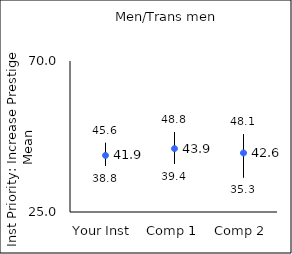
| Category | 25th percentile | 75th percentile | Mean |
|---|---|---|---|
| Your Inst | 38.8 | 45.6 | 41.86 |
| Comp 1 | 39.4 | 48.8 | 43.89 |
| Comp 2 | 35.3 | 48.1 | 42.59 |